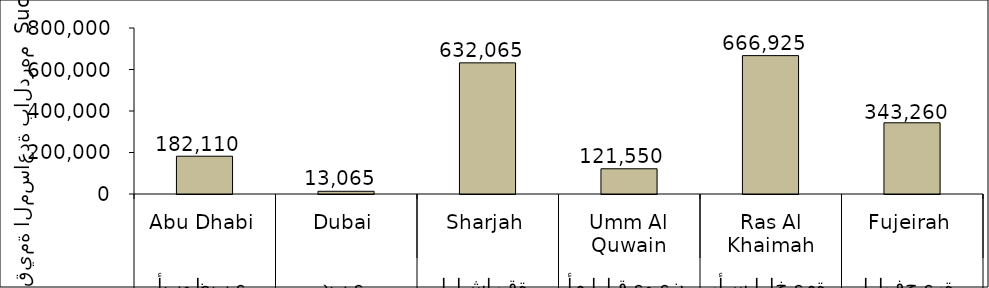
| Category | Series 0 |
|---|---|
| 0 | 182110 |
| 1 | 13065 |
| 2 | 632065 |
| 3 | 121550 |
| 4 | 666925 |
| 5 | 343260 |